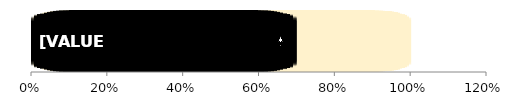
| Category | Total | Male  |
|---|---|---|
| 0 | 1 | 0.699 |